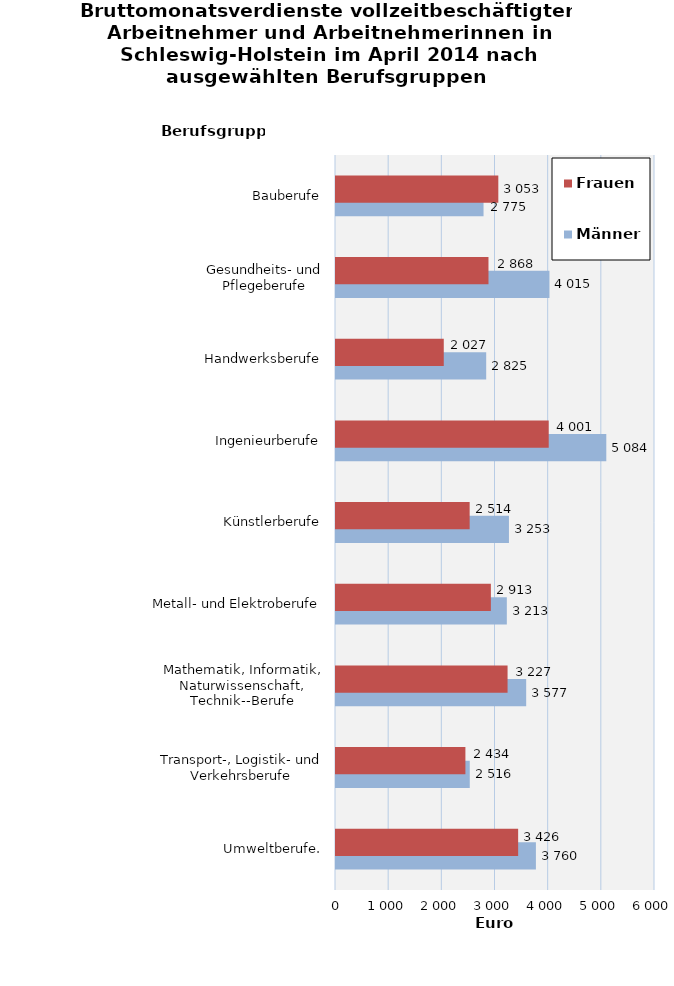
| Category | Männer | Frauen |
|---|---|---|
| Umweltberufe. | 3760 | 3426 |
| Transport-, Logistik- und Verkehrsberufe | 2516 | 2434 |
| Mathematik, Informatik, Naturwissenschaft, Technik--Berufe | 3577 | 3227 |
| Metall- und Elektroberufe | 3213 | 2913 |
| Künstlerberufe | 3253 | 2514 |
| Ingenieurberufe | 5084 | 4001 |
| Handwerksberufe | 2825 | 2027 |
| Gesundheits- und Pflegeberufe | 4015 | 2868 |
| Bauberufe | 2775 | 3053 |